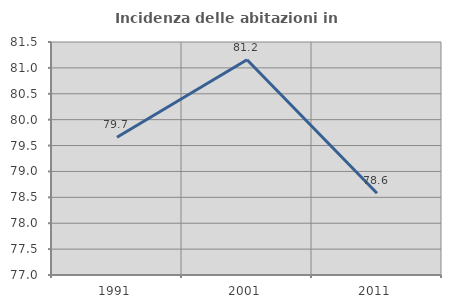
| Category | Incidenza delle abitazioni in proprietà  |
|---|---|
| 1991.0 | 79.661 |
| 2001.0 | 81.156 |
| 2011.0 | 78.578 |